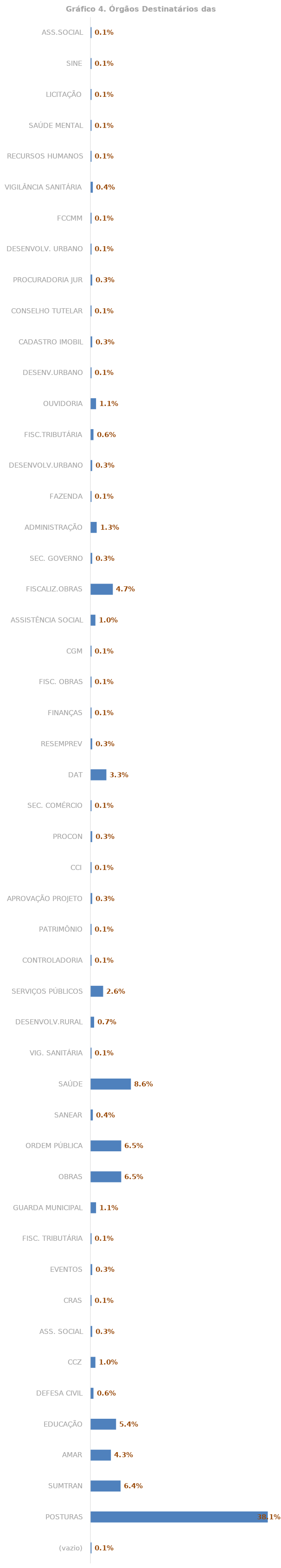
| Category | Total |
|---|---|
| (vazio) | 0.001 |
| POSTURAS | 0.381 |
| SUMTRAN | 0.064 |
| AMAR | 0.043 |
| EDUCAÇÃO | 0.054 |
| DEFESA CIVIL | 0.006 |
| CCZ | 0.01 |
| ASS. SOCIAL | 0.003 |
| CRAS | 0.001 |
| EVENTOS | 0.003 |
| FISC. TRIBUTÁRIA | 0.001 |
| GUARDA MUNICIPAL | 0.011 |
| OBRAS | 0.065 |
| ORDEM PÚBLICA | 0.065 |
| SANEAR | 0.004 |
| SAÚDE | 0.086 |
| VIG. SANITÁRIA | 0.001 |
| DESENVOLV.RURAL | 0.007 |
| SERVIÇOS PÚBLICOS | 0.026 |
| CONTROLADORIA | 0.001 |
| PATRIMÔNIO | 0.001 |
| APROVAÇÃO PROJETO | 0.003 |
| CCI | 0.001 |
| PROCON | 0.003 |
| SEC. COMÉRCIO | 0.001 |
| DAT | 0.033 |
| RESEMPREV | 0.003 |
| FINANÇAS | 0.001 |
| FISC. OBRAS | 0.001 |
| CGM | 0.001 |
| ASSISTÊNCIA SOCIAL | 0.01 |
| FISCALIZ.OBRAS | 0.047 |
| SEC. GOVERNO | 0.003 |
| ADMINISTRAÇÃO | 0.012 |
| FAZENDA | 0.001 |
| DESENVOLV.URBANO | 0.003 |
| FISC.TRIBUTÁRIA | 0.006 |
| OUVIDORIA | 0.011 |
| DESENV.URBANO | 0.001 |
| CADASTRO IMOBIL | 0.003 |
| CONSELHO TUTELAR | 0.001 |
| PROCURADORIA JUR | 0.003 |
| DESENVOLV. URBANO | 0.001 |
| FCCMM | 0.001 |
| VIGILÂNCIA SANITÁRIA | 0.004 |
| RECURSOS HUMANOS | 0.001 |
| SAÚDE MENTAL | 0.001 |
| LICITAÇÃO | 0.001 |
| SINE | 0.001 |
| ASS.SOCIAL | 0.001 |